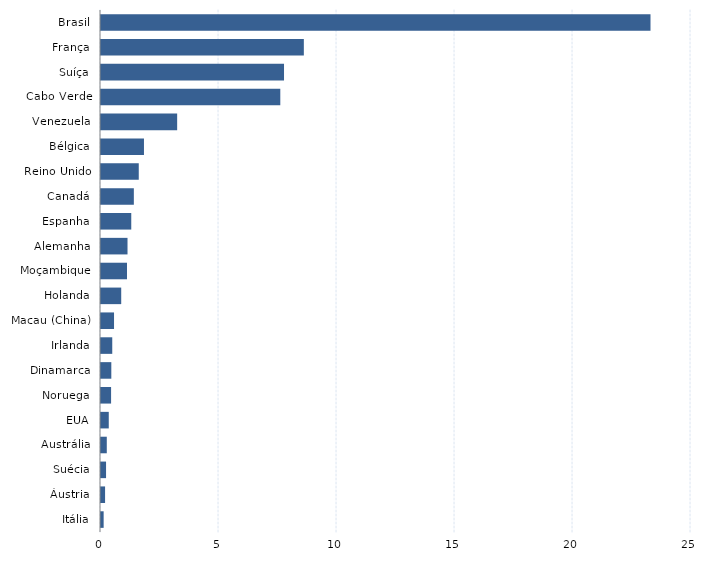
| Category | Series 0 |
|---|---|
| Itália | 0.112 |
| Áustria | 0.173 |
| Suécia | 0.214 |
| Austrália | 0.245 |
| EUA | 0.329 |
| Noruega | 0.427 |
| Dinamarca | 0.437 |
| Irlanda | 0.477 |
| Macau (China) | 0.552 |
| Holanda | 0.857 |
| Moçambique | 1.101 |
| Alemanha | 1.123 |
| Espanha | 1.282 |
| Canadá | 1.392 |
| Reino Unido | 1.6 |
| Bélgica | 1.821 |
| Venezuela | 3.227 |
| Cabo Verde | 7.597 |
| Suíça | 7.755 |
| França | 8.595 |
| Brasil | 23.284 |